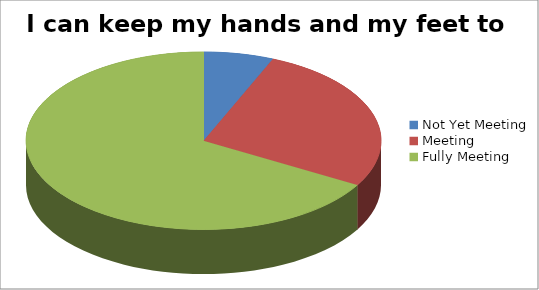
| Category | I can keep my hands and my feet to myself |
|---|---|
| Not Yet Meeting | 9 |
| Meeting | 38 |
| Fully Meeting | 94 |